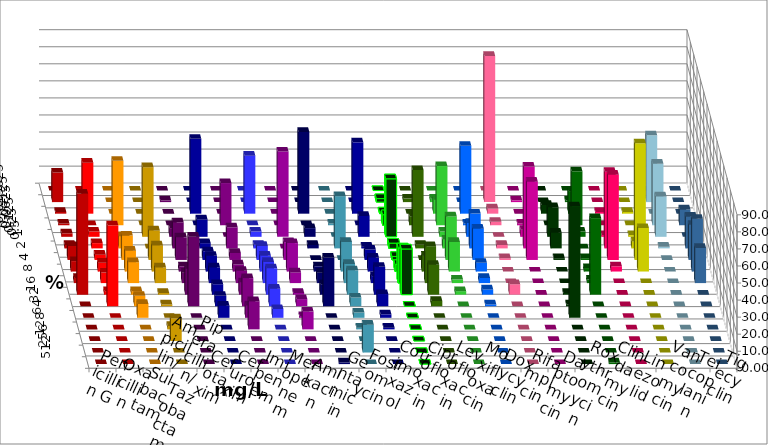
| Category | Penicillin G | Oxacillin | Ampicillin/ Sulbactam | Piperacillin/ Tazobactam | Cefotaxim | Cefuroxim | Imipenem | Meropenem | Amikacin | Gentamicin | Fosfomycin | Cotrimoxazol | Ciprofloxacin | Levofloxacin | Moxifloxacin | Doxycyclin | Rifampicin | Daptomycin | Roxythromycin | Clindamycin | Linezolid | Vancomycin | Teicoplanin | Tigecyclin |
|---|---|---|---|---|---|---|---|---|---|---|---|---|---|---|---|---|---|---|---|---|---|---|---|---|
| 0.015625 | 0 | 0 | 0 | 0 | 0 | 0 | 0 | 0 | 0 | 0 | 0 | 0 | 0 | 0 | 0 | 0 | 0 | 0 | 0 | 0 | 0 | 0 | 0 | 0 |
| 0.03125 | 17.347 | 0 | 0 | 0 | 1.02 | 0 | 0 | 0 | 0 | 0 | 0 | 0 | 2.062 | 2.062 | 2.041 | 0 | 85.714 | 1.02 | 0 | 1.02 | 0 | 0 | 0 | 39.175 |
| 0.0625 | 1.02 | 29.897 | 0 | 0 | 0 | 0 | 43.878 | 34.021 | 0 | 47.959 | 0 | 41.837 | 1.031 | 0 | 8.163 | 39.796 | 3.061 | 0 | 5.102 | 13.265 | 1.02 | 1.02 | 0 | 0 |
| 0.125 | 1.02 | 0 | 37.755 | 0 | 0 | 24.742 | 0 | 0 | 0 | 0 | 1.02 | 0 | 6.186 | 5.155 | 34.694 | 1.02 | 2.041 | 1.02 | 0 | 31.633 | 0 | 0 | 9.278 | 36.082 |
| 0.25 | 2.041 | 3.093 | 0 | 40.816 | 5.102 | 0 | 10.204 | 3.093 | 50 | 5.102 | 0 | 12.245 | 34.021 | 39.175 | 3.061 | 8.163 | 0 | 4.082 | 17.347 | 3.061 | 1.02 | 1.02 | 0 | 23.711 |
| 0.5 | 2.041 | 3.093 | 7.143 | 0 | 15.306 | 12.371 | 3.061 | 2.062 | 0 | 2.041 | 30.612 | 1.02 | 3.093 | 2.062 | 5.102 | 20.408 | 2.041 | 47.959 | 9.184 | 0 | 44.898 | 4.082 | 18.557 | 1.031 |
| 1.0 | 8.163 | 3.093 | 14.286 | 17.347 | 13.265 | 4.124 | 5.102 | 8.247 | 10.417 | 0 | 0 | 6.122 | 2.062 | 0 | 25.51 | 18.367 | 1.02 | 45.918 | 1.02 | 1.02 | 50 | 68.367 | 20.619 | 0 |
| 2.0 | 6.122 | 5.155 | 12.245 | 15.306 | 3.061 | 4.124 | 9.184 | 9.278 | 16.667 | 3.061 | 17.347 | 8.163 | 4.124 | 9.278 | 17.347 | 5.102 | 0 | 0 | 0 | 2.041 | 3.061 | 25.51 | 30.928 | 0 |
| 4.0 | 3.061 | 6.186 | 12.245 | 9.184 | 6.122 | 7.216 | 9.184 | 12.371 | 6.25 | 6.122 | 11.224 | 4.082 | 20.619 | 21.649 | 2.041 | 3.061 | 0 | 0 | 0 | 2.041 | 0 | 0 | 20.619 | 0 |
| 8.0 | 59.184 | 2.062 | 2.041 | 1.02 | 15.306 | 7.216 | 6.122 | 15.464 | 1.042 | 6.122 | 14.286 | 16.327 | 26.804 | 17.526 | 2.041 | 3.061 | 6.122 | 0 | 1.02 | 44.898 | 0 | 0 | 0 | 0 |
| 16.0 | 0 | 47.423 | 6.122 | 1.02 | 40.816 | 16.495 | 6.122 | 10.309 | 4.167 | 28.571 | 5.102 | 7.143 | 0 | 3.093 | 0 | 1.02 | 0 | 0 | 1.02 | 0 | 0 | 0 | 0 | 0 |
| 32.0 | 0 | 0 | 8.163 | 0 | 0 | 7.216 | 7.143 | 5.155 | 1.042 | 0 | 3.061 | 2.041 | 0 | 0 | 0 | 0 | 0 | 0 | 65.306 | 0 | 0 | 0 | 0 | 0 |
| 64.0 | 0 | 0 | 0 | 2.041 | 0 | 16.495 | 0 | 0 | 10.417 | 0 | 1.02 | 1.02 | 0 | 0 | 0 | 0 | 0 | 0 | 0 | 0 | 0 | 0 | 0 | 0 |
| 128.0 | 0 | 0 | 0 | 13.265 | 0 | 0 | 0 | 0 | 0 | 0 | 0 | 0 | 0 | 0 | 0 | 0 | 0 | 0 | 0 | 0 | 0 | 0 | 0 | 0 |
| 256.0 | 0 | 0 | 0 | 0 | 0 | 0 | 0 | 0 | 0 | 0 | 16.327 | 0 | 0 | 0 | 0 | 0 | 0 | 0 | 0 | 0 | 0 | 0 | 0 | 0 |
| 512.0 | 0 | 0 | 0 | 0 | 0 | 0 | 0 | 0 | 0 | 1.02 | 0 | 0 | 0 | 0 | 0 | 0 | 0 | 0 | 0 | 1.02 | 0 | 0 | 0 | 0 |